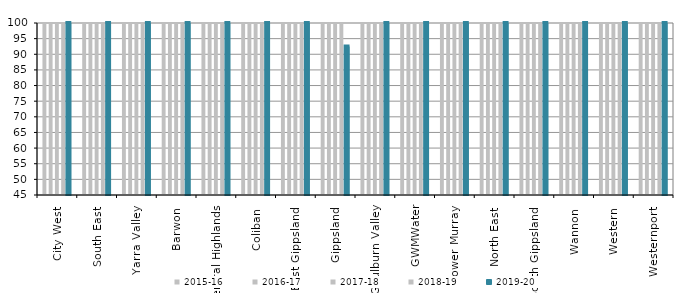
| Category | 2015-16 | 2016-17 | 2017-18 | 2018-19 | 2019-20 |
|---|---|---|---|---|---|
| City West  | 100 | 100 | 100 | 100 | 100 |
| South East  | 100 | 100 | 100 | 100 | 100 |
| Yarra Valley  | 100 | 100 | 100 | 100 | 100 |
| Barwon  | 100 | 99.9 | 100 | 100 | 100 |
| Central Highlands  | 100 | 100 | 100 | 100 | 100 |
| Coliban  | 100 | 100 | 100 | 100 | 100 |
| East Gippsland  | 100 | 100 | 100 | 100 | 100 |
| Gippsland  | 100 | 100 | 100 | 100 | 92.5 |
| Goulburn Valley  | 100 | 100 | 100 | 100 | 100 |
| GWMWater | 100 | 100 | 100 | 100 | 100 |
| Lower Murray  | 100 | 100 | 100 | 100 | 100 |
| North East  | 100 | 99.8 | 100 | 100 | 100 |
| South Gippsland  | 100 | 100 | 100 | 100 | 100 |
| Wannon  | 100 | 100 | 100 | 100 | 100 |
| Western  | 100 | 100 | 100 | 100 | 100 |
| Westernport  | 100 | 100 | 100 | 100 | 100 |